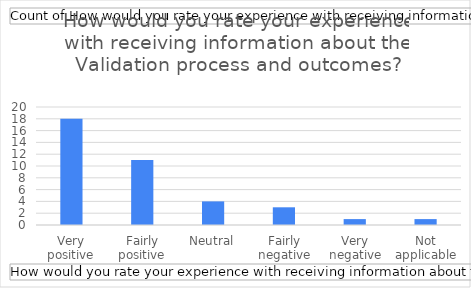
| Category | Total |
|---|---|
| Very positive | 18 |
| Fairly positive | 11 |
| Neutral | 4 |
| Fairly negative | 3 |
| Very negative | 1 |
| Not applicable | 1 |